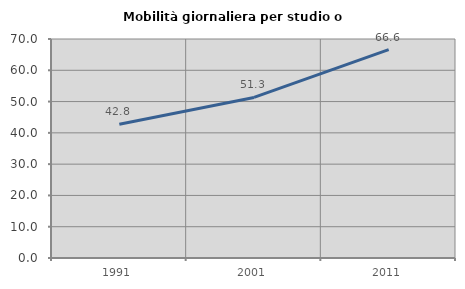
| Category | Mobilità giornaliera per studio o lavoro |
|---|---|
| 1991.0 | 42.753 |
| 2001.0 | 51.318 |
| 2011.0 | 66.622 |